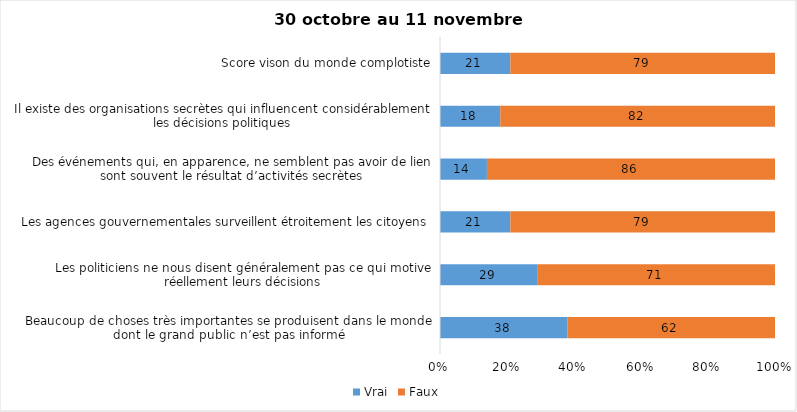
| Category | Vrai | Faux |
|---|---|---|
| Beaucoup de choses très importantes se produisent dans le monde dont le grand public n’est pas informé | 38 | 62 |
| Les politiciens ne nous disent généralement pas ce qui motive réellement leurs décisions | 29 | 71 |
| Les agences gouvernementales surveillent étroitement les citoyens | 21 | 79 |
| Des événements qui, en apparence, ne semblent pas avoir de lien sont souvent le résultat d’activités secrètes | 14 | 86 |
| Il existe des organisations secrètes qui influencent considérablement les décisions politiques | 18 | 82 |
| Score vison du monde complotiste | 21 | 79 |